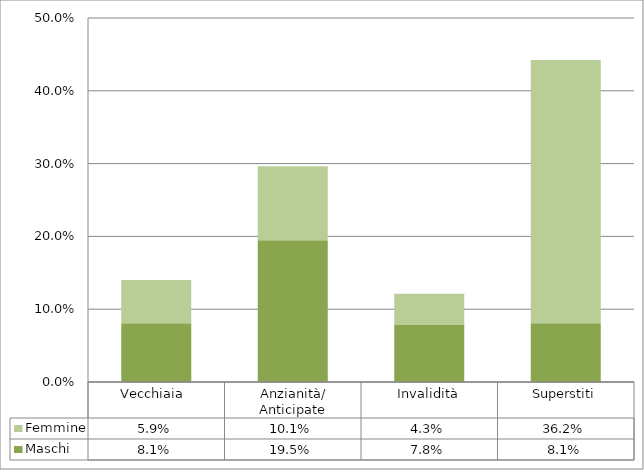
| Category | Maschi | Femmine |
|---|---|---|
| Vecchiaia  | 0.081 | 0.059 |
| Anzianità/ Anticipate | 0.195 | 0.101 |
| Invalidità | 0.078 | 0.043 |
| Superstiti | 0.081 | 0.362 |